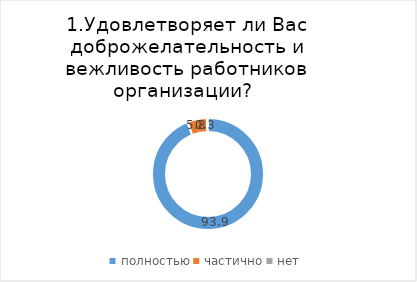
| Category | Северск |
|---|---|
| полностью | 93.935 |
| частично | 5.764 |
| нет | 0.301 |